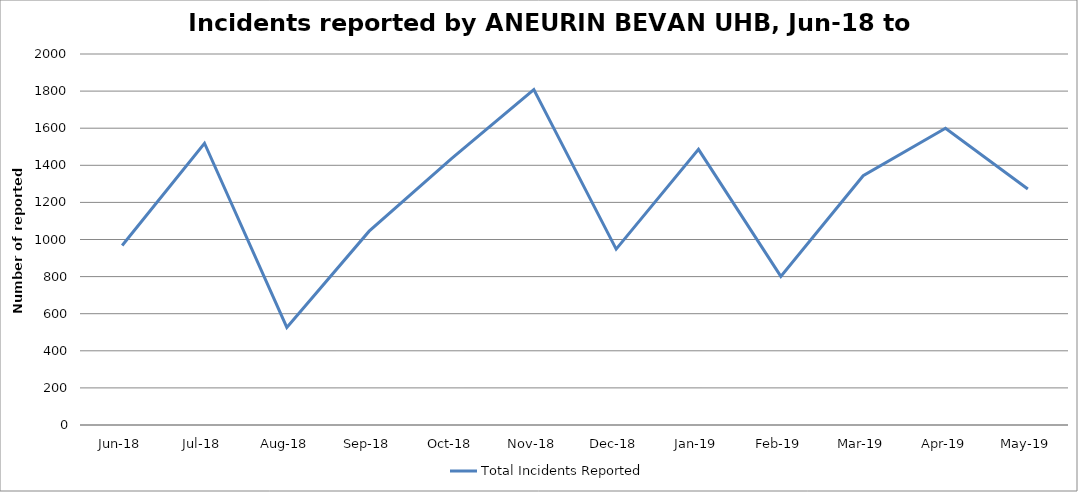
| Category | Total Incidents Reported |
|---|---|
| Jun-18 | 968 |
| Jul-18 | 1519 |
| Aug-18 | 526 |
| Sep-18 | 1045 |
| Oct-18 | 1436 |
| Nov-18 | 1808 |
| Dec-18 | 948 |
| Jan-19 | 1486 |
| Feb-19 | 801 |
| Mar-19 | 1344 |
| Apr-19 | 1600 |
| May-19 | 1272 |